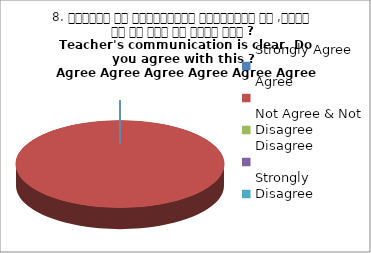
| Category | 8. शिक्षक का सम्प्रेषण सुस्पष्ठ है ,क्या आप इस बात से सहमत हैं ?
Teacher's communication is clear. Do you agree with this ? 
 Agree Agree Agree Agree Agree Agree |
|---|---|
| Strongly Agree | 0 |
| Agree | 4 |
| Not Agree & Not Disagree | 0 |
| Disagree | 0 |
| Strongly Disagree | 0 |